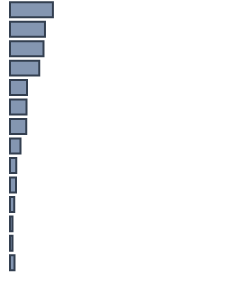
| Category | Series 0 |
|---|---|
| 0 | 18.9 |
| 1 | 15.4 |
| 2 | 14.8 |
| 3 | 12.9 |
| 4 | 7.5 |
| 5 | 7.3 |
| 6 | 7.2 |
| 7 | 4.6 |
| 8 | 2.7 |
| 9 | 2.6 |
| 10 | 1.9 |
| 11 | 1.1 |
| 12 | 1.1 |
| 13 | 2 |
| 14 | 0 |